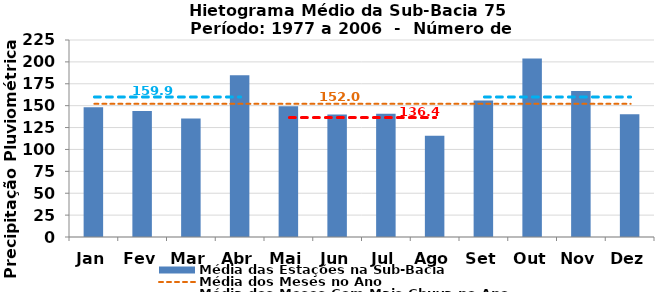
| Category | Média das Estações na Sub-Bacia |
|---|---|
| Jan | 148.137 |
| Fev | 143.84 |
| Mar | 135.427 |
| Abr | 184.692 |
| Mai | 149.225 |
| Jun | 140.001 |
| Jul | 140.745 |
| Ago | 115.65 |
| Set | 156.019 |
| Out | 203.836 |
| Nov | 166.842 |
| Dez | 140.178 |